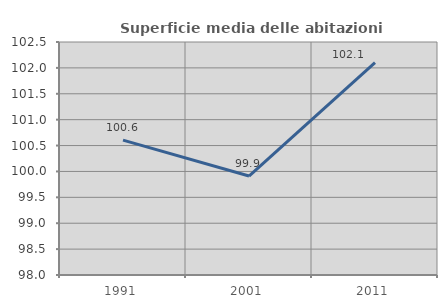
| Category | Superficie media delle abitazioni occupate |
|---|---|
| 1991.0 | 100.605 |
| 2001.0 | 99.911 |
| 2011.0 | 102.103 |